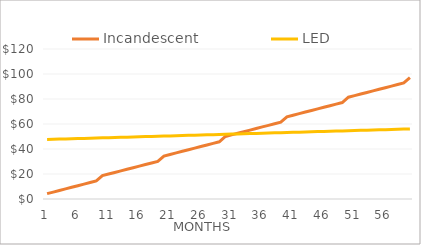
| Category | Incandescent | Series 2 | LED |
|---|---|---|---|
| 1.0 | 4.268 |  | 47.643 |
| 2.0 | 5.537 |  | 47.785 |
| 3.0 | 6.805 |  | 47.928 |
| 4.0 | 8.074 |  | 48.071 |
| 5.0 | 9.342 |  | 48.213 |
| 6.0 | 10.61 |  | 48.356 |
| 7.0 | 11.879 |  | 48.499 |
| 8.0 | 13.147 |  | 48.642 |
| 9.0 | 14.416 |  | 48.784 |
| 10.0 | 18.684 |  | 48.927 |
| 11.0 | 19.952 |  | 49.07 |
| 12.0 | 21.221 |  | 49.212 |
| 13.0 | 22.489 |  | 49.355 |
| 14.0 | 23.758 |  | 49.498 |
| 15.0 | 25.026 |  | 49.64 |
| 16.0 | 26.294 |  | 49.783 |
| 17.0 | 27.563 |  | 49.926 |
| 18.0 | 28.831 |  | 50.069 |
| 19.0 | 30.1 |  | 50.211 |
| 20.0 | 34.368 |  | 50.354 |
| 21.0 | 35.636 |  | 50.497 |
| 22.0 | 36.905 |  | 50.639 |
| 23.0 | 38.173 |  | 50.782 |
| 24.0 | 39.442 |  | 50.925 |
| 25.0 | 40.71 |  | 51.067 |
| 26.0 | 41.978 |  | 51.21 |
| 27.0 | 43.247 |  | 51.353 |
| 28.0 | 44.515 |  | 51.495 |
| 29.0 | 45.784 |  | 51.638 |
| 30.0 | 50.052 |  | 51.781 |
| 31.0 | 51.32 |  | 51.924 |
| 32.0 | 52.589 |  | 52.066 |
| 33.0 | 53.857 |  | 52.209 |
| 34.0 | 55.126 |  | 52.352 |
| 35.0 | 56.394 |  | 52.494 |
| 36.0 | 57.662 |  | 52.637 |
| 37.0 | 58.931 |  | 52.78 |
| 38.0 | 60.199 |  | 52.922 |
| 39.0 | 61.468 |  | 53.065 |
| 40.0 | 65.736 |  | 53.208 |
| 41.0 | 67.004 |  | 53.35 |
| 42.0 | 68.273 |  | 53.493 |
| 43.0 | 69.541 |  | 53.636 |
| 44.0 | 70.81 |  | 53.779 |
| 45.0 | 72.078 |  | 53.921 |
| 46.0 | 73.346 |  | 54.064 |
| 47.0 | 74.615 |  | 54.207 |
| 48.0 | 75.883 |  | 54.349 |
| 49.0 | 77.152 |  | 54.492 |
| 50.0 | 81.42 |  | 54.635 |
| 51.0 | 82.688 |  | 54.777 |
| 52.0 | 83.957 |  | 54.92 |
| 53.0 | 85.225 |  | 55.063 |
| 54.0 | 86.494 |  | 55.206 |
| 55.0 | 87.762 |  | 55.348 |
| 56.0 | 89.03 |  | 55.491 |
| 57.0 | 90.299 |  | 55.634 |
| 58.0 | 91.567 |  | 55.776 |
| 59.0 | 92.836 |  | 55.919 |
| 60.0 | 97.104 |  | 56.062 |